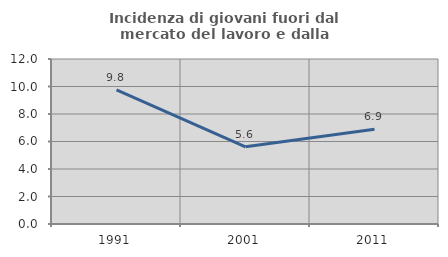
| Category | Incidenza di giovani fuori dal mercato del lavoro e dalla formazione  |
|---|---|
| 1991.0 | 9.755 |
| 2001.0 | 5.612 |
| 2011.0 | 6.893 |